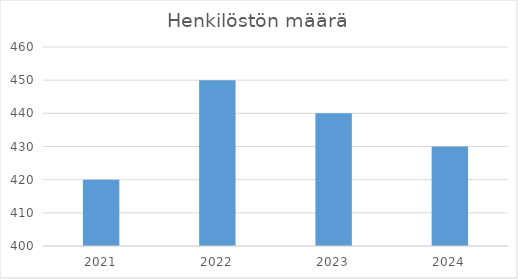
| Category | Henkilöstön määrä |
|---|---|
| 2021.0 | 420 |
| 2022.0 | 450 |
| 2023.0 | 440 |
| 2024.0 | 430 |